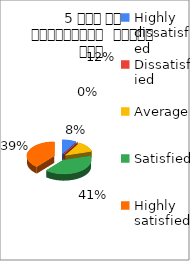
| Category | 5 समय पर पाठ्यक्रम  पूर्ण हुआ  |
|---|---|
| Highly dissatisfied | 5 |
| Dissatisfied | 0 |
| Average | 7 |
| Satisfied | 24 |
| Highly satisfied | 23 |